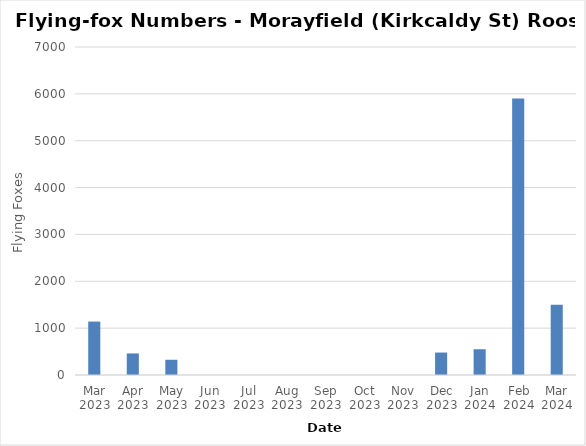
| Category | Flying-foxes |
|---|---|
| Mar 2023 | 1140 |
| Apr 2023 | 460 |
| May 2023 | 325 |
| Jun 2023 | 0 |
| Jul 2023 | 0 |
| Aug 2023 | 0 |
| Sep 2023 | 0 |
| Oct 2023 | 0 |
| Nov 2023 | 0 |
| Dec 2023 | 479 |
| Jan 2024 | 550 |
| Feb 2024 | 5900 |
| Mar 2024 | 1500 |